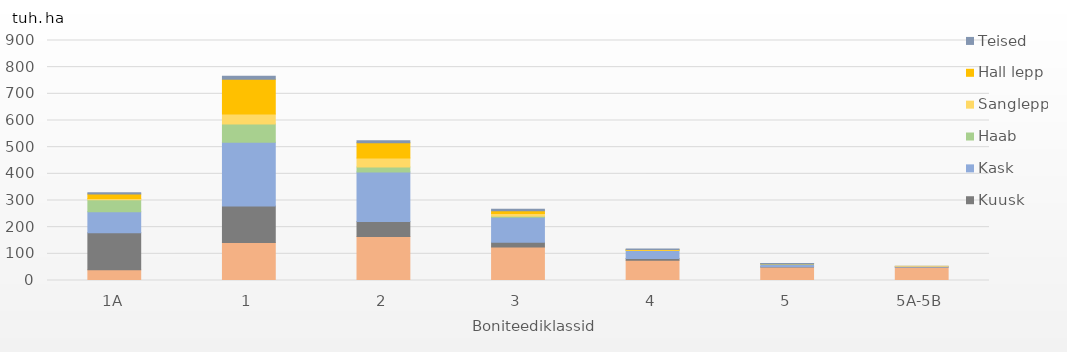
| Category | Mänd | Kuusk | Kask | Haab | Sanglepp | Hall lepp | Teised |
|---|---|---|---|---|---|---|---|
| 0 | 39.992 | 139.44 | 78.597 | 45.13 | 4.206 | 16.948 | 4.999 |
| 1 | 142.728 | 136.727 | 238.557 | 69.022 | 37.786 | 129.426 | 11.957 |
| 2 | 165.059 | 55.994 | 185.69 | 18.994 | 33.499 | 56.865 | 7.869 |
| 3 | 125.859 | 17.891 | 93.483 | 3.741 | 10.224 | 10.164 | 5.943 |
| 4 | 76.24 | 6.587 | 29.243 | 0.624 | 1.427 | 1.959 | 2.391 |
| 5 | 50.405 | 1.403 | 10.535 | 0.156 | 0.468 | 0.156 | 0.468 |
| 6 | 50.688 | 0.217 | 2.182 | 0 | 0.156 | 0 | 0 |